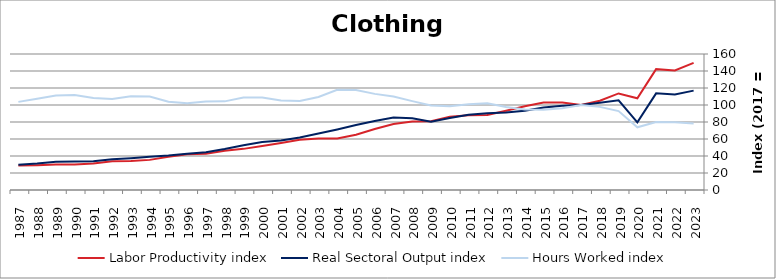
| Category | Labor Productivity index | Real Sectoral Output index | Hours Worked index |
|---|---|---|---|
| 2023.0 | 149.599 | 116.911 | 78.15 |
| 2022.0 | 140.7 | 112.333 | 79.839 |
| 2021.0 | 142.177 | 113.723 | 79.986 |
| 2020.0 | 107.957 | 79.614 | 73.746 |
| 2019.0 | 113.604 | 105.444 | 92.817 |
| 2018.0 | 104.993 | 102.682 | 97.799 |
| 2017.0 | 100 | 100 | 100 |
| 2016.0 | 102.888 | 99.018 | 96.239 |
| 2015.0 | 102.862 | 97.148 | 94.445 |
| 2014.0 | 98.588 | 93.327 | 94.664 |
| 2013.0 | 93.302 | 91.085 | 97.624 |
| 2012.0 | 88.279 | 90.182 | 102.156 |
| 2011.0 | 87.93 | 88.63 | 100.796 |
| 2010.0 | 86.085 | 84.81 | 98.519 |
| 2009.0 | 80.837 | 80.4 | 99.459 |
| 2008.0 | 80.633 | 84.301 | 104.549 |
| 2007.0 | 77.688 | 85.411 | 109.942 |
| 2006.0 | 71.854 | 81.257 | 113.086 |
| 2005.0 | 65.034 | 76.459 | 117.569 |
| 2004.0 | 60.472 | 71.256 | 117.832 |
| 2003.0 | 60.718 | 66.492 | 109.51 |
| 2002.0 | 59.007 | 61.787 | 104.712 |
| 2001.0 | 55.257 | 58.175 | 105.281 |
| 2000.0 | 51.78 | 56.408 | 108.937 |
| 1999.0 | 48.389 | 52.676 | 108.86 |
| 1998.0 | 46.212 | 48.193 | 104.285 |
| 1997.0 | 42.616 | 44.413 | 104.217 |
| 1996.0 | 41.948 | 42.788 | 102.002 |
| 1995.0 | 39.112 | 40.575 | 103.741 |
| 1994.0 | 35.441 | 39.018 | 110.092 |
| 1993.0 | 34.022 | 37.478 | 110.158 |
| 1992.0 | 33.777 | 36.146 | 107.011 |
| 1991.0 | 31.197 | 33.785 | 108.296 |
| 1990.0 | 29.907 | 33.399 | 111.675 |
| 1989.0 | 29.959 | 33.302 | 111.159 |
| 1988.0 | 29.12 | 31.27 | 107.38 |
| 1987.0 | 28.727 | 29.787 | 103.69 |